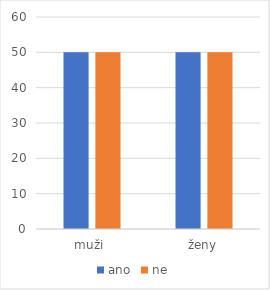
| Category | ano | ne |
|---|---|---|
| muži  | 50 | 50 |
| ženy | 50 | 50 |